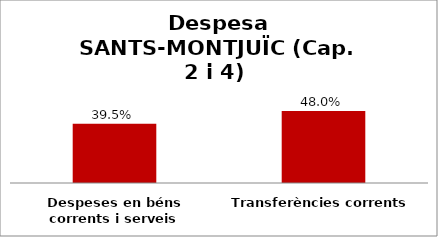
| Category | Series 0 |
|---|---|
| Despeses en béns corrents i serveis | 0.395 |
| Transferències corrents | 0.48 |